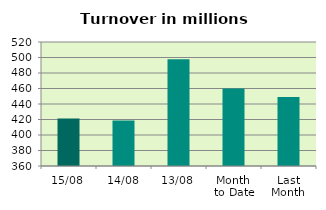
| Category | Series 0 |
|---|---|
| 15/08 | 421.134 |
| 14/08 | 418.723 |
| 13/08 | 497.651 |
| Month 
to Date | 459.949 |
| Last
Month | 448.907 |